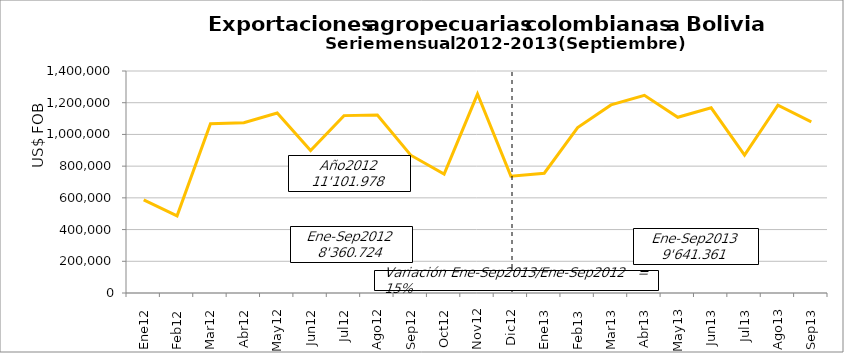
| Category | Series 0 |
|---|---|
| 0 | 587535.02 |
| 1 | 486697.17 |
| 2 | 1067538.45 |
| 3 | 1074228.96 |
| 4 | 1134983.1 |
| 5 | 899038.01 |
| 6 | 1118606.94 |
| 7 | 1122971.73 |
| 8 | 869124.33 |
| 9 | 749813.69 |
| 10 | 1254646.8 |
| 11 | 736794.17 |
| 12 | 755315.95 |
| 13 | 1043581.34 |
| 14 | 1186242.38 |
| 15 | 1246624.24 |
| 16 | 1108326.88 |
| 17 | 1167671.72 |
| 18 | 869765.1 |
| 19 | 1184385.87 |
| 20 | 1079447.99 |